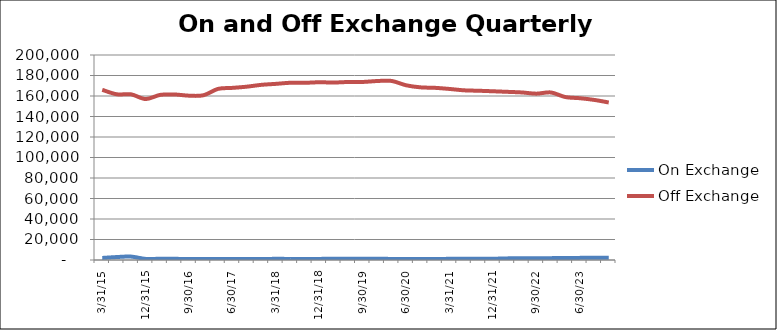
| Category | On Exchange | Off Exchange |
|---|---|---|
| 3/31/15 | 2002 | 166035 |
| 6/30/15 | 2869 | 161677 |
| 9/30/15 | 3310 | 161613 |
| 12/31/15 | 1075 | 157026 |
| 3/31/16 | 1211 | 161072 |
| 6/30/16 | 1142 | 161478 |
| 9/30/16 | 977 | 160315 |
| 12/31/16 | 1000 | 160751 |
| 3/31/17 | 1020 | 166940 |
| 6/30/17 | 988 | 167933 |
| 9/30/17 | 933 | 169112 |
| 12/31/17 | 979 | 170900 |
| 3/31/18 | 1135 | 171847 |
| 6/30/18 | 1056 | 172912 |
| 9/30/18 | 1059 | 172868 |
| 12/31/18 | 1092 | 173415 |
| 3/31/19 | 1118 | 173138 |
| 6/30/19 | 1143 | 173676 |
| 9/30/19 | 1152 | 173700 |
| 12/31/19 | 1196 | 174607 |
| 3/31/20 | 1059 | 174680 |
| 6/30/20 | 1034 | 170450 |
| 9/30/20 | 1031 | 168432 |
| 12/31/20 | 1011 | 167954 |
| 3/31/21 | 1124 | 166871 |
| 6/30/21 | 1124 | 165532 |
| 9/30/21 | 1125 | 165130 |
| 12/31/21 | 1215 | 164614 |
| 3/31/22 | 1580 | 164055 |
| 6/30/22 | 1616 | 163468 |
| 9/30/22 | 1703 | 162276 |
| 12/31/22 | 1811 | 163472 |
| 3/31/23 | 1995 | 158967 |
| 6/30/23 | 2072 | 157850 |
| 9/30/23 | 2135 | 156176 |
| 12/31/23 | 2218 | 153667 |